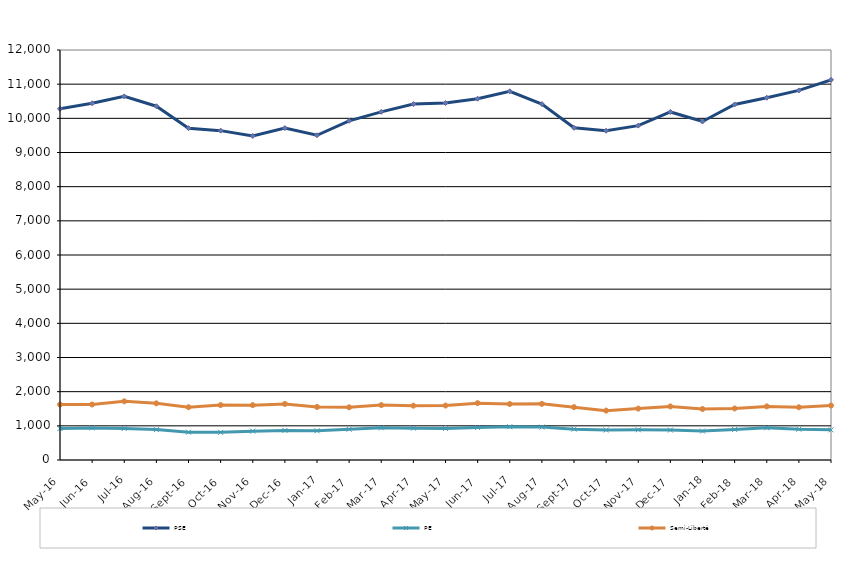
| Category | PSE | PE | Semi-Liberté |
|---|---|---|---|
| 2016-05-01 | 10278 | 920 | 1621 |
| 2016-06-01 | 10441 | 939 | 1625 |
| 2016-07-01 | 10642 | 923 | 1718 |
| 2016-08-01 | 10355 | 890 | 1658 |
| 2016-09-01 | 9712 | 813 | 1546 |
| 2016-10-01 | 9640 | 809 | 1607 |
| 2016-11-01 | 9484 | 844 | 1605 |
| 2016-12-01 | 9714 | 866 | 1641 |
| 2017-01-01 | 9505 | 855 | 1553 |
| 2017-02-01 | 9927 | 900 | 1542 |
| 2017-03-01 | 10190 | 942 | 1607 |
| 2017-04-01 | 10417 | 931 | 1590 |
| 2017-05-01 | 10448 | 924 | 1594 |
| 2017-06-01 | 10575 | 951 | 1664 |
| 2017-07-01 | 10791 | 974 | 1639 |
| 2017-08-01 | 10417 | 963 | 1644 |
| 2017-09-01 | 9723 | 903 | 1547 |
| 2017-10-01 | 9637 | 879 | 1445 |
| 2017-11-01 | 9787 | 885 | 1504 |
| 2017-12-01 | 10187 | 876 | 1568 |
| 2018-01-01 | 9907 | 847 | 1493 |
| 2018-02-01 | 10406 | 895 | 1508 |
| 2018-03-01 | 10603 | 942 | 1569 |
| 2018-04-01 | 10817 | 901 | 1544 |
| 2018-05-01 | 11127 | 882 | 1594 |